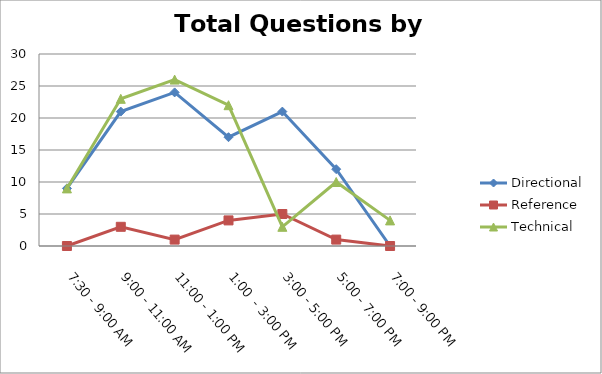
| Category | Directional | Reference | Technical |
|---|---|---|---|
| 7:30 - 9:00 AM | 9 | 0 | 9 |
| 9:00 - 11:00 AM | 21 | 3 | 23 |
| 11:00 - 1:00 PM | 24 | 1 | 26 |
| 1:00  - 3:00 PM | 17 | 4 | 22 |
| 3:00 - 5:00 PM | 21 | 5 | 3 |
| 5:00 - 7:00 PM | 12 | 1 | 10 |
| 7:00 - 9:00 PM | 0 | 0 | 4 |